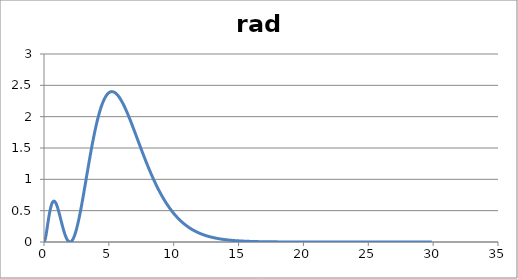
| Category | rad prob |
|---|---|
| 0.0 | 0 |
| 0.1 | 0.051 |
| 0.2 | 0.167 |
| 0.30000000000000004 | 0.303 |
| 0.4 | 0.431 |
| 0.5 | 0.536 |
| 0.6 | 0.608 |
| 0.7 | 0.646 |
| 0.7999999999999999 | 0.65 |
| 0.8999999999999999 | 0.626 |
| 0.9999999999999999 | 0.578 |
| 1.0999999999999999 | 0.512 |
| 1.2 | 0.436 |
| 1.3 | 0.354 |
| 1.4000000000000001 | 0.273 |
| 1.5000000000000002 | 0.197 |
| 1.6000000000000003 | 0.13 |
| 1.7000000000000004 | 0.075 |
| 1.8000000000000005 | 0.034 |
| 1.9000000000000006 | 0.008 |
| 2.0000000000000004 | 0 |
| 2.1000000000000005 | 0.008 |
| 2.2000000000000006 | 0.034 |
| 2.3000000000000007 | 0.075 |
| 2.400000000000001 | 0.131 |
| 2.500000000000001 | 0.201 |
| 2.600000000000001 | 0.284 |
| 2.700000000000001 | 0.377 |
| 2.800000000000001 | 0.479 |
| 2.9000000000000012 | 0.589 |
| 3.0000000000000013 | 0.704 |
| 3.1000000000000014 | 0.823 |
| 3.2000000000000015 | 0.944 |
| 3.3000000000000016 | 1.066 |
| 3.4000000000000017 | 1.188 |
| 3.5000000000000018 | 1.307 |
| 3.600000000000002 | 1.424 |
| 3.700000000000002 | 1.536 |
| 3.800000000000002 | 1.644 |
| 3.900000000000002 | 1.746 |
| 4.000000000000002 | 1.841 |
| 4.100000000000001 | 1.93 |
| 4.200000000000001 | 2.011 |
| 4.300000000000001 | 2.085 |
| 4.4 | 2.15 |
| 4.5 | 2.208 |
| 4.6 | 2.258 |
| 4.699999999999999 | 2.301 |
| 4.799999999999999 | 2.335 |
| 4.899999999999999 | 2.362 |
| 4.999999999999998 | 2.381 |
| 5.099999999999998 | 2.394 |
| 5.1999999999999975 | 2.399 |
| 5.299999999999997 | 2.398 |
| 5.399999999999997 | 2.391 |
| 5.4999999999999964 | 2.379 |
| 5.599999999999996 | 2.361 |
| 5.699999999999996 | 2.338 |
| 5.799999999999995 | 2.31 |
| 5.899999999999995 | 2.278 |
| 5.999999999999995 | 2.243 |
| 6.099999999999994 | 2.204 |
| 6.199999999999994 | 2.162 |
| 6.299999999999994 | 2.117 |
| 6.399999999999993 | 2.07 |
| 6.499999999999993 | 2.02 |
| 6.5999999999999925 | 1.97 |
| 6.699999999999992 | 1.917 |
| 6.799999999999992 | 1.864 |
| 6.8999999999999915 | 1.81 |
| 6.999999999999991 | 1.755 |
| 7.099999999999991 | 1.699 |
| 7.19999999999999 | 1.644 |
| 7.29999999999999 | 1.588 |
| 7.39999999999999 | 1.533 |
| 7.499999999999989 | 1.478 |
| 7.599999999999989 | 1.424 |
| 7.699999999999989 | 1.37 |
| 7.799999999999988 | 1.317 |
| 7.899999999999988 | 1.265 |
| 7.999999999999988 | 1.214 |
| 8.099999999999987 | 1.164 |
| 8.199999999999987 | 1.115 |
| 8.299999999999986 | 1.067 |
| 8.399999999999986 | 1.021 |
| 8.499999999999986 | 0.976 |
| 8.599999999999985 | 0.932 |
| 8.699999999999985 | 0.889 |
| 8.799999999999985 | 0.848 |
| 8.899999999999984 | 0.808 |
| 8.999999999999984 | 0.769 |
| 9.099999999999984 | 0.732 |
| 9.199999999999983 | 0.696 |
| 9.299999999999983 | 0.662 |
| 9.399999999999983 | 0.629 |
| 9.499999999999982 | 0.597 |
| 9.599999999999982 | 0.566 |
| 9.699999999999982 | 0.537 |
| 9.799999999999981 | 0.509 |
| 9.89999999999998 | 0.482 |
| 9.99999999999998 | 0.456 |
| 10.09999999999998 | 0.432 |
| 10.19999999999998 | 0.408 |
| 10.29999999999998 | 0.386 |
| 10.399999999999979 | 0.365 |
| 10.499999999999979 | 0.345 |
| 10.599999999999978 | 0.325 |
| 10.699999999999978 | 0.307 |
| 10.799999999999978 | 0.289 |
| 10.899999999999977 | 0.273 |
| 10.999999999999977 | 0.257 |
| 11.099999999999977 | 0.242 |
| 11.199999999999976 | 0.228 |
| 11.299999999999976 | 0.215 |
| 11.399999999999975 | 0.202 |
| 11.499999999999975 | 0.19 |
| 11.599999999999975 | 0.179 |
| 11.699999999999974 | 0.168 |
| 11.799999999999974 | 0.158 |
| 11.899999999999974 | 0.148 |
| 11.999999999999973 | 0.139 |
| 12.099999999999973 | 0.13 |
| 12.199999999999973 | 0.122 |
| 12.299999999999972 | 0.115 |
| 12.399999999999972 | 0.108 |
| 12.499999999999972 | 0.101 |
| 12.599999999999971 | 0.094 |
| 12.69999999999997 | 0.088 |
| 12.79999999999997 | 0.083 |
| 12.89999999999997 | 0.078 |
| 12.99999999999997 | 0.073 |
| 13.09999999999997 | 0.068 |
| 13.199999999999969 | 0.064 |
| 13.299999999999969 | 0.059 |
| 13.399999999999968 | 0.056 |
| 13.499999999999968 | 0.052 |
| 13.599999999999968 | 0.048 |
| 13.699999999999967 | 0.045 |
| 13.799999999999967 | 0.042 |
| 13.899999999999967 | 0.039 |
| 13.999999999999966 | 0.037 |
| 14.099999999999966 | 0.034 |
| 14.199999999999966 | 0.032 |
| 14.299999999999965 | 0.03 |
| 14.399999999999965 | 0.028 |
| 14.499999999999964 | 0.026 |
| 14.599999999999964 | 0.024 |
| 14.699999999999964 | 0.023 |
| 14.799999999999963 | 0.021 |
| 14.899999999999963 | 0.02 |
| 14.999999999999963 | 0.018 |
| 15.099999999999962 | 0.017 |
| 15.199999999999962 | 0.016 |
| 15.299999999999962 | 0.015 |
| 15.399999999999961 | 0.014 |
| 15.499999999999961 | 0.013 |
| 15.59999999999996 | 0.012 |
| 15.69999999999996 | 0.011 |
| 15.79999999999996 | 0.01 |
| 15.89999999999996 | 0.01 |
| 15.99999999999996 | 0.009 |
| 16.09999999999996 | 0.008 |
| 16.19999999999996 | 0.008 |
| 16.29999999999996 | 0.007 |
| 16.399999999999963 | 0.007 |
| 16.499999999999964 | 0.006 |
| 16.599999999999966 | 0.006 |
| 16.699999999999967 | 0.005 |
| 16.79999999999997 | 0.005 |
| 16.89999999999997 | 0.005 |
| 16.99999999999997 | 0.004 |
| 17.099999999999973 | 0.004 |
| 17.199999999999974 | 0.004 |
| 17.299999999999976 | 0.003 |
| 17.399999999999977 | 0.003 |
| 17.49999999999998 | 0.003 |
| 17.59999999999998 | 0.003 |
| 17.69999999999998 | 0.002 |
| 17.799999999999983 | 0.002 |
| 17.899999999999984 | 0.002 |
| 17.999999999999986 | 0.002 |
| 18.099999999999987 | 0.002 |
| 18.19999999999999 | 0.002 |
| 18.29999999999999 | 0.002 |
| 18.39999999999999 | 0.001 |
| 18.499999999999993 | 0.001 |
| 18.599999999999994 | 0.001 |
| 18.699999999999996 | 0.001 |
| 18.799999999999997 | 0.001 |
| 18.9 | 0.001 |
| 19.0 | 0.001 |
| 19.1 | 0.001 |
| 19.200000000000003 | 0.001 |
| 19.300000000000004 | 0.001 |
| 19.400000000000006 | 0.001 |
| 19.500000000000007 | 0.001 |
| 19.60000000000001 | 0.001 |
| 19.70000000000001 | 0.001 |
| 19.80000000000001 | 0 |
| 19.900000000000013 | 0 |
| 20.000000000000014 | 0 |
| 20.100000000000016 | 0 |
| 20.200000000000017 | 0 |
| 20.30000000000002 | 0 |
| 20.40000000000002 | 0 |
| 20.50000000000002 | 0 |
| 20.600000000000023 | 0 |
| 20.700000000000024 | 0 |
| 20.800000000000026 | 0 |
| 20.900000000000027 | 0 |
| 21.00000000000003 | 0 |
| 21.10000000000003 | 0 |
| 21.20000000000003 | 0 |
| 21.300000000000033 | 0 |
| 21.400000000000034 | 0 |
| 21.500000000000036 | 0 |
| 21.600000000000037 | 0 |
| 21.70000000000004 | 0 |
| 21.80000000000004 | 0 |
| 21.90000000000004 | 0 |
| 22.000000000000043 | 0 |
| 22.100000000000044 | 0 |
| 22.200000000000045 | 0 |
| 22.300000000000047 | 0 |
| 22.40000000000005 | 0 |
| 22.50000000000005 | 0 |
| 22.60000000000005 | 0 |
| 22.700000000000053 | 0 |
| 22.800000000000054 | 0 |
| 22.900000000000055 | 0 |
| 23.000000000000057 | 0 |
| 23.10000000000006 | 0 |
| 23.20000000000006 | 0 |
| 23.30000000000006 | 0 |
| 23.400000000000063 | 0 |
| 23.500000000000064 | 0 |
| 23.600000000000065 | 0 |
| 23.700000000000067 | 0 |
| 23.800000000000068 | 0 |
| 23.90000000000007 | 0 |
| 24.00000000000007 | 0 |
| 24.100000000000072 | 0 |
| 24.200000000000074 | 0 |
| 24.300000000000075 | 0 |
| 24.400000000000077 | 0 |
| 24.500000000000078 | 0 |
| 24.60000000000008 | 0 |
| 24.70000000000008 | 0 |
| 24.800000000000082 | 0 |
| 24.900000000000084 | 0 |
| 25.000000000000085 | 0 |
| 25.100000000000087 | 0 |
| 25.200000000000088 | 0 |
| 25.30000000000009 | 0 |
| 25.40000000000009 | 0 |
| 25.500000000000092 | 0 |
| 25.600000000000094 | 0 |
| 25.700000000000095 | 0 |
| 25.800000000000097 | 0 |
| 25.900000000000098 | 0 |
| 26.0000000000001 | 0 |
| 26.1000000000001 | 0 |
| 26.200000000000102 | 0 |
| 26.300000000000104 | 0 |
| 26.400000000000105 | 0 |
| 26.500000000000107 | 0 |
| 26.600000000000108 | 0 |
| 26.70000000000011 | 0 |
| 26.80000000000011 | 0 |
| 26.900000000000112 | 0 |
| 27.000000000000114 | 0 |
| 27.100000000000115 | 0 |
| 27.200000000000117 | 0 |
| 27.300000000000118 | 0 |
| 27.40000000000012 | 0 |
| 27.50000000000012 | 0 |
| 27.600000000000122 | 0 |
| 27.700000000000124 | 0 |
| 27.800000000000125 | 0 |
| 27.900000000000126 | 0 |
| 28.000000000000128 | 0 |
| 28.10000000000013 | 0 |
| 28.20000000000013 | 0 |
| 28.300000000000132 | 0 |
| 28.400000000000134 | 0 |
| 28.500000000000135 | 0 |
| 28.600000000000136 | 0 |
| 28.700000000000138 | 0 |
| 28.80000000000014 | 0 |
| 28.90000000000014 | 0 |
| 29.000000000000142 | 0 |
| 29.100000000000144 | 0 |
| 29.200000000000145 | 0 |
| 29.300000000000146 | 0 |
| 29.400000000000148 | 0 |
| 29.50000000000015 | 0 |
| 29.60000000000015 | 0 |
| 29.700000000000152 | 0 |
| 29.800000000000153 | 0 |
| 29.900000000000155 | 0 |